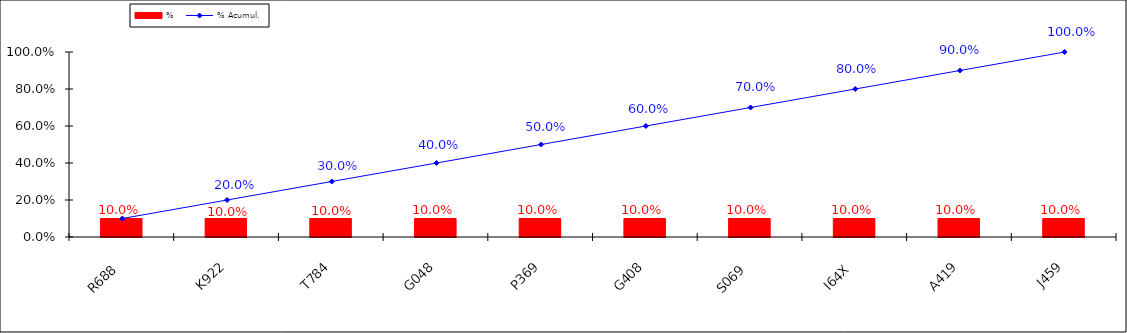
| Category | % |
|---|---|
| R688 | 0.1 |
| K922 | 0.1 |
| T784 | 0.1 |
| G048 | 0.1 |
| P369 | 0.1 |
| G408 | 0.1 |
| S069 | 0.1 |
| I64X | 0.1 |
| A419 | 0.1 |
| J459 | 0.1 |